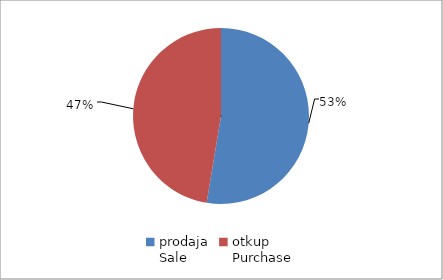
| Category | Series 0 |
|---|---|
| prodaja
Sale | 98971691.82 |
| otkup
Purchase | 89126558.6 |